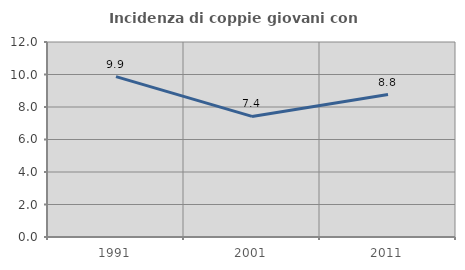
| Category | Incidenza di coppie giovani con figli |
|---|---|
| 1991.0 | 9.871 |
| 2001.0 | 7.422 |
| 2011.0 | 8.765 |